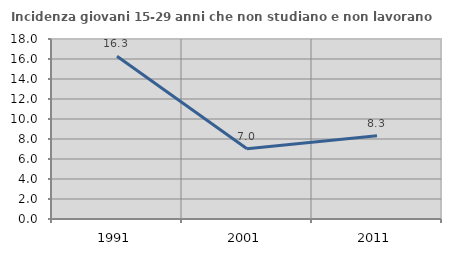
| Category | Incidenza giovani 15-29 anni che non studiano e non lavorano  |
|---|---|
| 1991.0 | 16.279 |
| 2001.0 | 7.018 |
| 2011.0 | 8.333 |